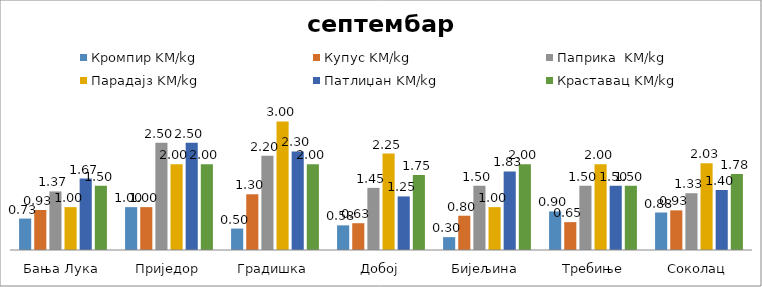
| Category | Кромпир KM/kg | Купус KM/kg | Паприка  KM/kg | Парадајз KM/kg | Патлиџан KM/kg | Краставац KM/kg |
|---|---|---|---|---|---|---|
| Бања Лука | 0.733 | 0.933 | 1.367 | 1 | 1.667 | 1.5 |
| Приједор | 1 | 1 | 2.5 | 2 | 2.5 | 2 |
| Градишка | 0.5 | 1.3 | 2.2 | 3 | 2.3 | 2 |
| Добој | 0.575 | 0.625 | 1.45 | 2.25 | 1.25 | 1.75 |
| Бијељина | 0.3 | 0.8 | 1.5 | 1 | 1.833 | 2 |
|  Требиње | 0.9 | 0.65 | 1.5 | 2 | 1.5 | 1.5 |
| Соколац | 0.875 | 0.925 | 1.325 | 2.025 | 1.4 | 1.775 |